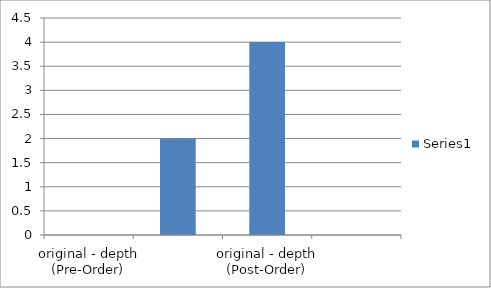
| Category | Series 0 |
|---|---|
| original - depth (Pre-Order) | 0 |
| original - depth (In-Order) | 2 |
| original - depth (Post-Order) | 4 |
| breadth | 0 |